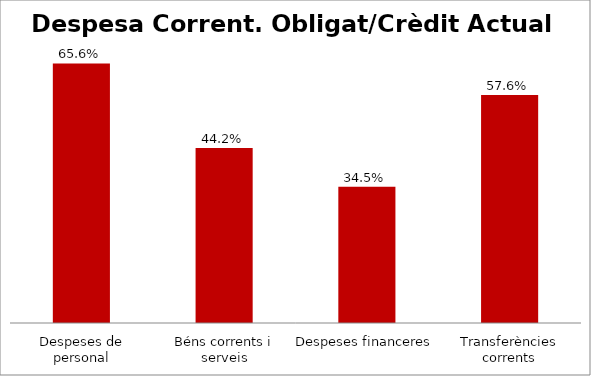
| Category | Series 0 |
|---|---|
| Despeses de personal | 0.656 |
| Béns corrents i serveis | 0.442 |
| Despeses financeres | 0.345 |
| Transferències corrents | 0.576 |